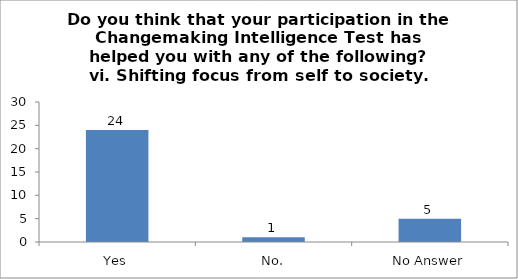
| Category | Do you think that your participation in the Changemaking Intelligence Test has helped you with any of the following?
vi. Shifting focus from self to society. |
|---|---|
| Yes | 24 |
| No. | 1 |
| No Answer | 5 |